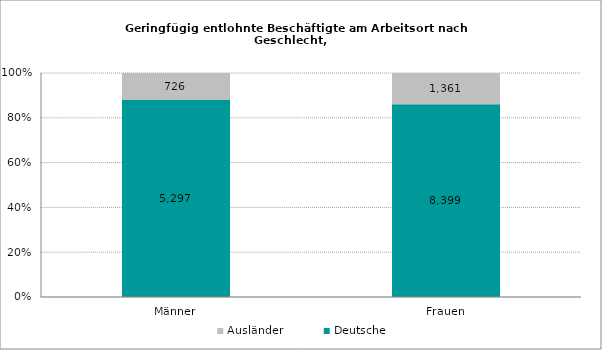
| Category | Deutsche | Ausländer |
|---|---|---|
| Männer | 5297 | 726 |
| Frauen | 8399 | 1361 |